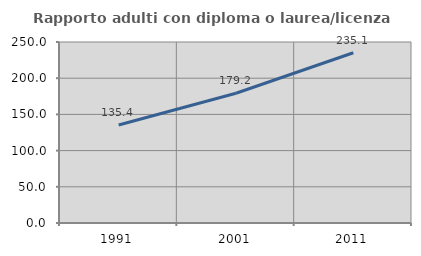
| Category | Rapporto adulti con diploma o laurea/licenza media  |
|---|---|
| 1991.0 | 135.417 |
| 2001.0 | 179.167 |
| 2011.0 | 235.135 |